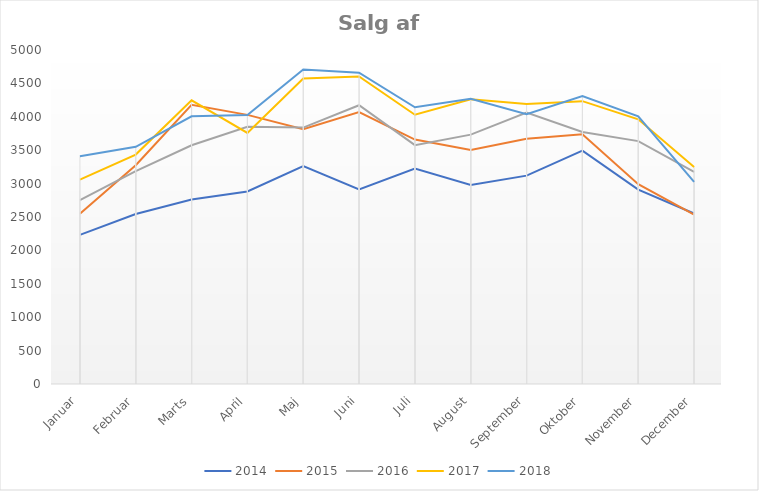
| Category | 2014 | 2015 | 2016 | 2017 | 2018 |
|---|---|---|---|---|---|
| Januar | 2232 | 2547 | 2753 | 3059 | 3408 |
| Februar | 2545 | 3274 | 3187 | 3435 | 3551 |
| Marts | 2762 | 4180 | 3574 | 4246 | 4008 |
| April | 2882 | 4029 | 3850 | 3758 | 4027 |
| Maj | 3262 | 3813 | 3838 | 4572 | 4708 |
| Juni | 2913 | 4070 | 4173 | 4603 | 4661 |
| Juli | 3224 | 3659 | 3576 | 4031 | 4143 |
| August | 2978 | 3504 | 3733 | 4261 | 4271 |
| September | 3119 | 3671 | 4065 | 4193 | 4039 |
| Oktober | 3494 | 3738 | 3772 | 4234 | 4309 |
| November | 2910 | 2991 | 3636 | 3962 | 4008 |
| December | 2552 | 2537 | 3175 | 3247 | 3027 |